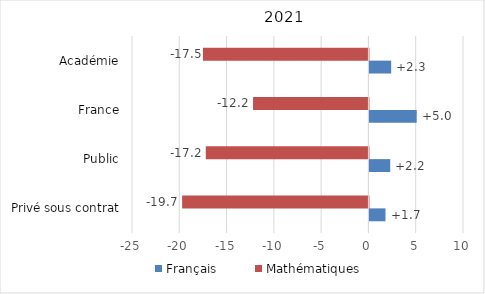
| Category | Français | Mathématiques |
|---|---|---|
| Privé sous contrat | 1.7 | -19.7 |
| Public | 2.2 | -17.2 |
| France | 5 | -12.2 |
| Académie | 2.3 | -17.5 |